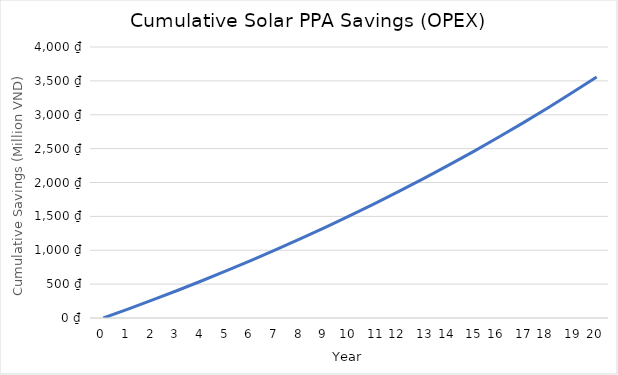
| Category | Cumulative Solar PPA Savings (OPEX) |
|---|---|
| 0.0 | 0 |
| 1.0 | 131283126 |
| 2.0 | 266612397.943 |
| 3.0 | 406112518.048 |
| 4.0 | 549912031.854 |
| 5.0 | 698143446.676 |
| 6.0 | 850943353.702 |
| 7.0 | 1008452553.864 |
| 8.0 | 1170816187.574 |
| 9.0 | 1338183868.475 |
| 10.0 | 1510709821.301 |
| 11.0 | 1688553023.994 |
| 12.0 | 1871877354.193 |
| 13.0 | 2060851740.249 |
| 14.0 | 2255650316.884 |
| 15.0 | 2456452585.65 |
| 16.0 | 2663443580.34 |
| 17.0 | 2876814037.486 |
| 18.0 | 3096760572.121 |
| 19.0 | 3323485858.954 |
| 20.0 | 3557198819.127 |